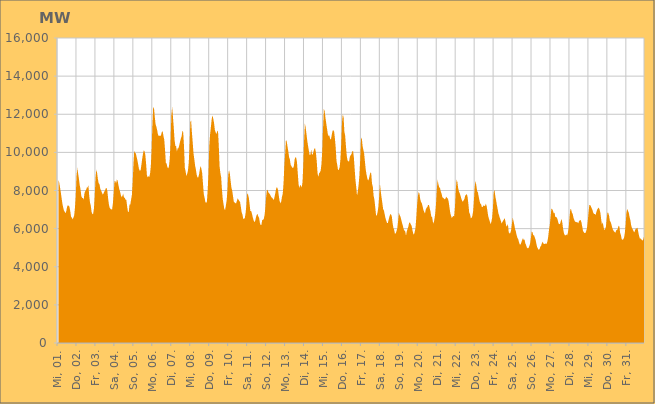
| Category | Series 0 |
|---|---|
|  Mi, 01.  | 8571.647 |
|  Mi, 01.  | 8426.877 |
|  Mi, 01.  | 8174.192 |
|  Mi, 01.  | 7919.734 |
|  Mi, 01.  | 7615.612 |
|  Mi, 01.  | 7327.224 |
|  Mi, 01.  | 7123.743 |
|  Mi, 01.  | 6951.614 |
|  Mi, 01.  | 6889.42 |
|  Mi, 01.  | 6799.561 |
|  Mi, 01.  | 6918.251 |
|  Mi, 01.  | 7138.162 |
|  Mi, 01.  | 7220.877 |
|  Mi, 01.  | 7203.933 |
|  Mi, 01.  | 7142.081 |
|  Mi, 01.  | 6918.803 |
|  Mi, 01.  | 6635.14 |
|  Do, 02.  | 6570.064 |
|  Do, 02.  | 6494.347 |
|  Do, 02.  | 6576.544 |
|  Do, 02.  | 6701.221 |
|  Do, 02.  | 7106.355 |
|  Do, 02.  | 7741.961 |
|  Do, 02.  | 8745.921 |
|  Do, 02.  | 9194.909 |
|  Do, 02.  | 8880.697 |
|  Do, 02.  | 8610.397 |
|  Do, 02.  | 8279.688 |
|  Do, 02.  | 8065.954 |
|  Do, 02.  | 7710.196 |
|  Do, 02.  | 7613.746 |
|  Do, 02.  | 7604.504 |
|  Do, 02.  | 7521.258 |
|  Do, 02.  | 7854.901 |
|  Do, 02.  | 7972.572 |
|  Do, 02.  | 8030.984 |
|  Do, 02.  | 8151.544 |
|  Do, 02.  | 8163.946 |
|  Do, 02.  | 8269.278 |
|  Do, 02.  | 7725.154 |
|  Do, 02.  | 7374.644 |
|  Fr, 03.  | 7199.698 |
|  Fr, 03.  | 6880.816 |
|  Fr, 03.  | 6752.79 |
|  Fr, 03.  | 6785.406 |
|  Fr, 03.  | 7052.271 |
|  Fr, 03.  | 7707.023 |
|  Fr, 03.  | 8664.792 |
|  Fr, 03.  | 9097.281 |
|  Fr, 03.  | 8911.047 |
|  Fr, 03.  | 8594.239 |
|  Fr, 03.  | 8380.961 |
|  Fr, 03.  | 8333.97 |
|  Fr, 03.  | 8096.653 |
|  Fr, 03.  | 7998.343 |
|  Fr, 03.  | 7906.099 |
|  Fr, 03.  | 7783.794 |
|  Fr, 03.  | 7829.25 |
|  Fr, 03.  | 7941.611 |
|  Fr, 03.  | 7988.13 |
|  Fr, 03.  | 8112.931 |
|  Fr, 03.  | 8135.249 |
|  Fr, 03.  | 7959.463 |
|  Fr, 03.  | 7563.892 |
|  Fr, 03.  | 7247.544 |
|  Sa, 04.  | 7086.04 |
|  Sa, 04.  | 7039.534 |
|  Sa, 04.  | 7000.788 |
|  Sa, 04.  | 7015.111 |
|  Sa, 04.  | 7328.287 |
|  Sa, 04.  | 7860.821 |
|  Sa, 04.  | 8484.789 |
|  Sa, 04.  | 8502.943 |
|  Sa, 04.  | 8368.934 |
|  Sa, 04.  | 8575.022 |
|  Sa, 04.  | 8508.639 |
|  Sa, 04.  | 8285.451 |
|  Sa, 04.  | 8081.265 |
|  Sa, 04.  | 7948.269 |
|  Sa, 04.  | 7762.259 |
|  Sa, 04.  | 7648.3 |
|  Sa, 04.  | 7708.836 |
|  Sa, 04.  | 7834.646 |
|  Sa, 04.  | 7631.67 |
|  Sa, 04.  | 7615.977 |
|  Sa, 04.  | 7518.765 |
|  Sa, 04.  | 7505.922 |
|  Sa, 04.  | 7175.152 |
|  Sa, 04.  | 6902.39 |
|  So, 05.  | 6861.662 |
|  So, 05.  | 7260.344 |
|  So, 05.  | 7257.732 |
|  So, 05.  | 7509.298 |
|  So, 05.  | 7756.565 |
|  So, 05.  | 8413.171 |
|  So, 05.  | 9349.163 |
|  So, 05.  | 10081.156 |
|  So, 05.  | 9991.604 |
|  So, 05.  | 9938.82 |
|  So, 05.  | 9767.937 |
|  So, 05.  | 9586.613 |
|  So, 05.  | 9366.691 |
|  So, 05.  | 9129.687 |
|  So, 05.  | 9039.358 |
|  So, 05.  | 9048.405 |
|  So, 05.  | 9320.406 |
|  So, 05.  | 9638.77 |
|  So, 05.  | 9907.633 |
|  So, 05.  | 10113.699 |
|  So, 05.  | 10064.82 |
|  So, 05.  | 9890.508 |
|  So, 05.  | 9410.213 |
|  So, 05.  | 8817.177 |
|  Mo, 06.  | 8687.779 |
|  Mo, 06.  | 8754.114 |
|  Mo, 06.  | 8704.742 |
|  Mo, 06.  | 8874.14 |
|  Mo, 06.  | 9290.863 |
|  Mo, 06.  | 10154.68 |
|  Mo, 06.  | 11438.301 |
|  Mo, 06.  | 12376.24 |
|  Mo, 06.  | 12323.719 |
|  Mo, 06.  | 11864.464 |
|  Mo, 06.  | 11479.18 |
|  Mo, 06.  | 11346.597 |
|  Mo, 06.  | 11166.686 |
|  Mo, 06.  | 10949.411 |
|  Mo, 06.  | 10861.368 |
|  Mo, 06.  | 10879.682 |
|  Mo, 06.  | 10859.749 |
|  Mo, 06.  | 10918.038 |
|  Mo, 06.  | 11075.591 |
|  Mo, 06.  | 11112.388 |
|  Mo, 06.  | 10859.448 |
|  Mo, 06.  | 10662.116 |
|  Mo, 06.  | 10127.498 |
|  Mo, 06.  | 9459.695 |
|  Di, 07.  | 9400.318 |
|  Di, 07.  | 9224.206 |
|  Di, 07.  | 9159.105 |
|  Di, 07.  | 9281.644 |
|  Di, 07.  | 9706.687 |
|  Di, 07.  | 10569.595 |
|  Di, 07.  | 11954.95 |
|  Di, 07.  | 12383.971 |
|  Di, 07.  | 11879.901 |
|  Di, 07.  | 11315.155 |
|  Di, 07.  | 10670.19 |
|  Di, 07.  | 10344.357 |
|  Di, 07.  | 10328.845 |
|  Di, 07.  | 10048.882 |
|  Di, 07.  | 10216.811 |
|  Di, 07.  | 10223.369 |
|  Di, 07.  | 10368.972 |
|  Di, 07.  | 10566.913 |
|  Di, 07.  | 10717.155 |
|  Di, 07.  | 10849.11 |
|  Di, 07.  | 11140.287 |
|  Di, 07.  | 11038.815 |
|  Di, 07.  | 10316.7 |
|  Di, 07.  | 9191.994 |
|  Mi, 08.  | 9006.042 |
|  Mi, 08.  | 8763.545 |
|  Mi, 08.  | 8868.43 |
|  Mi, 08.  | 9051.291 |
|  Mi, 08.  | 9469.174 |
|  Mi, 08.  | 10294.295 |
|  Mi, 08.  | 11597.989 |
|  Mi, 08.  | 11656.389 |
|  Mi, 08.  | 11040.685 |
|  Mi, 08.  | 10524.808 |
|  Mi, 08.  | 9962.422 |
|  Mi, 08.  | 9647.922 |
|  Mi, 08.  | 9318.093 |
|  Mi, 08.  | 9101.162 |
|  Mi, 08.  | 8838.934 |
|  Mi, 08.  | 8690.254 |
|  Mi, 08.  | 8679.062 |
|  Mi, 08.  | 8834.679 |
|  Mi, 08.  | 9101.332 |
|  Mi, 08.  | 9290.782 |
|  Mi, 08.  | 9139.991 |
|  Mi, 08.  | 8912.955 |
|  Mi, 08.  | 8375.249 |
|  Mi, 08.  | 7813.641 |
|  Do, 09.  | 7629.327 |
|  Do, 09.  | 7403.606 |
|  Do, 09.  | 7343.431 |
|  Do, 09.  | 7425.999 |
|  Do, 09.  | 8048.599 |
|  Do, 09.  | 8943.596 |
|  Do, 09.  | 10354.489 |
|  Do, 09.  | 10941.685 |
|  Do, 09.  | 11324.456 |
|  Do, 09.  | 11727.201 |
|  Do, 09.  | 11946.569 |
|  Do, 09.  | 11770.654 |
|  Do, 09.  | 11549.791 |
|  Do, 09.  | 11187.017 |
|  Do, 09.  | 11058.278 |
|  Do, 09.  | 10961.582 |
|  Do, 09.  | 11096.683 |
|  Do, 09.  | 11142.685 |
|  Do, 09.  | 10359.959 |
|  Do, 09.  | 9279.158 |
|  Do, 09.  | 8920.823 |
|  Do, 09.  | 8707.169 |
|  Do, 09.  | 8059.932 |
|  Do, 09.  | 7558.827 |
|  Fr, 10.  | 7290.935 |
|  Fr, 10.  | 7029.924 |
|  Fr, 10.  | 6979.596 |
|  Fr, 10.  | 7212.165 |
|  Fr, 10.  | 7490.523 |
|  Fr, 10.  | 7985.756 |
|  Fr, 10.  | 8819.296 |
|  Fr, 10.  | 9075.813 |
|  Fr, 10.  | 8886.171 |
|  Fr, 10.  | 8500.165 |
|  Fr, 10.  | 8154.371 |
|  Fr, 10.  | 7996.891 |
|  Fr, 10.  | 7713.795 |
|  Fr, 10.  | 7416.882 |
|  Fr, 10.  | 7378.273 |
|  Fr, 10.  | 7333.653 |
|  Fr, 10.  | 7334.386 |
|  Fr, 10.  | 7456.261 |
|  Fr, 10.  | 7600.766 |
|  Fr, 10.  | 7516.403 |
|  Fr, 10.  | 7447.968 |
|  Fr, 10.  | 7388.597 |
|  Fr, 10.  | 7126.645 |
|  Fr, 10.  | 6846.75 |
|  Sa, 11.  | 6735.657 |
|  Sa, 11.  | 6502.311 |
|  Sa, 11.  | 6524.645 |
|  Sa, 11.  | 6554.593 |
|  Sa, 11.  | 6838.809 |
|  Sa, 11.  | 7246.53 |
|  Sa, 11.  | 7852.489 |
|  Sa, 11.  | 7798.046 |
|  Sa, 11.  | 7628.296 |
|  Sa, 11.  | 7288.512 |
|  Sa, 11.  | 6919.213 |
|  Sa, 11.  | 6931.408 |
|  Sa, 11.  | 6779.353 |
|  Sa, 11.  | 6600.198 |
|  Sa, 11.  | 6446.27 |
|  Sa, 11.  | 6350.43 |
|  Sa, 11.  | 6391.78 |
|  Sa, 11.  | 6578.94 |
|  Sa, 11.  | 6719.998 |
|  Sa, 11.  | 6774.377 |
|  Sa, 11.  | 6639.628 |
|  Sa, 11.  | 6563.166 |
|  Sa, 11.  | 6313.126 |
|  Sa, 11.  | 6183.622 |
|  So, 12.  | 6199.043 |
|  So, 12.  | 6463.026 |
|  So, 12.  | 6452.082 |
|  So, 12.  | 6514.975 |
|  So, 12.  | 6718.402 |
|  So, 12.  | 7124.816 |
|  So, 12.  | 7684.024 |
|  So, 12.  | 8041.953 |
|  So, 12.  | 8009.718 |
|  So, 12.  | 7878.899 |
|  So, 12.  | 7845.7 |
|  So, 12.  | 7780.018 |
|  So, 12.  | 7695.036 |
|  So, 12.  | 7624.28 |
|  So, 12.  | 7606.221 |
|  So, 12.  | 7506.109 |
|  So, 12.  | 7557.176 |
|  So, 12.  | 7744.917 |
|  So, 12.  | 7961.736 |
|  So, 12.  | 8166.429 |
|  So, 12.  | 8152.623 |
|  So, 12.  | 8035.42 |
|  So, 12.  | 7712.305 |
|  So, 12.  | 7456.712 |
|  Mo, 13.  | 7329.712 |
|  Mo, 13.  | 7419.99 |
|  Mo, 13.  | 7669.958 |
|  Mo, 13.  | 7834.72 |
|  Mo, 13.  | 8403.221 |
|  Mo, 13.  | 9275.598 |
|  Mo, 13.  | 9916.2 |
|  Mo, 13.  | 10653.949 |
|  Mo, 13.  | 10570.78 |
|  Mo, 13.  | 10306.35 |
|  Mo, 13.  | 10062.44 |
|  Mo, 13.  | 9747.009 |
|  Mo, 13.  | 9620.906 |
|  Mo, 13.  | 9349.781 |
|  Mo, 13.  | 9278.465 |
|  Mo, 13.  | 9201.595 |
|  Mo, 13.  | 9173.783 |
|  Mo, 13.  | 9269.227 |
|  Mo, 13.  | 9619.164 |
|  Mo, 13.  | 9746.51 |
|  Mo, 13.  | 9719.824 |
|  Mo, 13.  | 9483.224 |
|  Mo, 13.  | 8908.112 |
|  Mo, 13.  | 8335.508 |
|  Di, 14.  | 8130.729 |
|  Di, 14.  | 8287.101 |
|  Di, 14.  | 8254.573 |
|  Di, 14.  | 8158.058 |
|  Di, 14.  | 8443.309 |
|  Di, 14.  | 9364.601 |
|  Di, 14.  | 10623.518 |
|  Di, 14.  | 11514.606 |
|  Di, 14.  | 11298.218 |
|  Di, 14.  | 10971.051 |
|  Di, 14.  | 10611.005 |
|  Di, 14.  | 10347.548 |
|  Di, 14.  | 10091.946 |
|  Di, 14.  | 9867.667 |
|  Di, 14.  | 9871.143 |
|  Di, 14.  | 10157.194 |
|  Di, 14.  | 9887.849 |
|  Di, 14.  | 9888.646 |
|  Di, 14.  | 10056.588 |
|  Di, 14.  | 10203.695 |
|  Di, 14.  | 10197.688 |
|  Di, 14.  | 9978.392 |
|  Di, 14.  | 9534.342 |
|  Di, 14.  | 8912.538 |
|  Mi, 15.  | 8716.574 |
|  Mi, 15.  | 8897.079 |
|  Mi, 15.  | 8955.884 |
|  Mi, 15.  | 9048.334 |
|  Mi, 15.  | 9396.29 |
|  Mi, 15.  | 10090.04 |
|  Mi, 15.  | 11282.926 |
|  Mi, 15.  | 12278.925 |
|  Mi, 15.  | 12170.096 |
|  Mi, 15.  | 11827.609 |
|  Mi, 15.  | 11532.026 |
|  Mi, 15.  | 11250.75 |
|  Mi, 15.  | 10966.156 |
|  Mi, 15.  | 10863.369 |
|  Mi, 15.  | 10881.824 |
|  Mi, 15.  | 10703.479 |
|  Mi, 15.  | 10675.196 |
|  Mi, 15.  | 10917.86 |
|  Mi, 15.  | 11129.211 |
|  Mi, 15.  | 11163.338 |
|  Mi, 15.  | 11090.554 |
|  Mi, 15.  | 10727.101 |
|  Mi, 15.  | 10258.971 |
|  Mi, 15.  | 9556.182 |
|  Do, 16.  | 9332.393 |
|  Do, 16.  | 9069.282 |
|  Do, 16.  | 9097.368 |
|  Do, 16.  | 9219.017 |
|  Do, 16.  | 9638.445 |
|  Do, 16.  | 10464.05 |
|  Do, 16.  | 11607.541 |
|  Do, 16.  | 11994.08 |
|  Do, 16.  | 11837.791 |
|  Do, 16.  | 11081.905 |
|  Do, 16.  | 10863.831 |
|  Do, 16.  | 10309.103 |
|  Do, 16.  | 9818.566 |
|  Do, 16.  | 9581.508 |
|  Do, 16.  | 9521.292 |
|  Do, 16.  | 9540.69 |
|  Do, 16.  | 9776.926 |
|  Do, 16.  | 9856.688 |
|  Do, 16.  | 9908.05 |
|  Do, 16.  | 10056.836 |
|  Do, 16.  | 10076.524 |
|  Do, 16.  | 9733.911 |
|  Do, 16.  | 9126.464 |
|  Do, 16.  | 8552.411 |
|  Fr, 17.  | 8182.188 |
|  Fr, 17.  | 7732.823 |
|  Fr, 17.  | 7955.387 |
|  Fr, 17.  | 8299.233 |
|  Fr, 17.  | 8778.813 |
|  Fr, 17.  | 9594.816 |
|  Fr, 17.  | 10663.317 |
|  Fr, 17.  | 10786.53 |
|  Fr, 17.  | 10330.884 |
|  Fr, 17.  | 10142.611 |
|  Fr, 17.  | 9936.526 |
|  Fr, 17.  | 9517.088 |
|  Fr, 17.  | 9106.264 |
|  Fr, 17.  | 8840.94 |
|  Fr, 17.  | 8638.714 |
|  Fr, 17.  | 8521.656 |
|  Fr, 17.  | 8605.41 |
|  Fr, 17.  | 8793.173 |
|  Fr, 17.  | 8962.855 |
|  Fr, 17.  | 8888.07 |
|  Fr, 17.  | 8351.574 |
|  Fr, 17.  | 8196.856 |
|  Fr, 17.  | 7730.287 |
|  Fr, 17.  | 7519.657 |
|  Sa, 18.  | 7144.951 |
|  Sa, 18.  | 6729.825 |
|  Sa, 18.  | 6666.669 |
|  Sa, 18.  | 6864.629 |
|  Sa, 18.  | 7133.513 |
|  Sa, 18.  | 7663.242 |
|  Sa, 18.  | 8343.352 |
|  Sa, 18.  | 7976.948 |
|  Sa, 18.  | 7638.613 |
|  Sa, 18.  | 7360.899 |
|  Sa, 18.  | 7035.741 |
|  Sa, 18.  | 6953.286 |
|  Sa, 18.  | 6757.861 |
|  Sa, 18.  | 6552.468 |
|  Sa, 18.  | 6416.377 |
|  Sa, 18.  | 6292.029 |
|  Sa, 18.  | 6291.692 |
|  Sa, 18.  | 6468.023 |
|  Sa, 18.  | 6632.127 |
|  Sa, 18.  | 6762.166 |
|  Sa, 18.  | 6739.355 |
|  Sa, 18.  | 6654.738 |
|  Sa, 18.  | 6289.734 |
|  Sa, 18.  | 6042.812 |
|  So, 19.  | 5935.71 |
|  So, 19.  | 5724.343 |
|  So, 19.  | 5756.77 |
|  So, 19.  | 5866.519 |
|  So, 19.  | 6023.539 |
|  So, 19.  | 6389.17 |
|  So, 19.  | 6832.478 |
|  So, 19.  | 6700.584 |
|  So, 19.  | 6630.952 |
|  So, 19.  | 6462.36 |
|  So, 19.  | 6293.355 |
|  So, 19.  | 6155.742 |
|  So, 19.  | 5974.207 |
|  So, 19.  | 5896.663 |
|  So, 19.  | 5850.025 |
|  So, 19.  | 5632.887 |
|  So, 19.  | 5859.322 |
|  So, 19.  | 5994.047 |
|  So, 19.  | 6114.193 |
|  So, 19.  | 6310.492 |
|  So, 19.  | 6325.426 |
|  So, 19.  | 6219.876 |
|  So, 19.  | 6164.741 |
|  So, 19.  | 5948.823 |
|  Mo, 20.  | 5762.01 |
|  Mo, 20.  | 5682.593 |
|  Mo, 20.  | 5826.37 |
|  Mo, 20.  | 6032.774 |
|  Mo, 20.  | 6575.039 |
|  Mo, 20.  | 7230.556 |
|  Mo, 20.  | 7680.36 |
|  Mo, 20.  | 7922.865 |
|  Mo, 20.  | 7842.076 |
|  Mo, 20.  | 7544.018 |
|  Mo, 20.  | 7401.527 |
|  Mo, 20.  | 7326.072 |
|  Mo, 20.  | 7166.263 |
|  Mo, 20.  | 6982.161 |
|  Mo, 20.  | 6884.113 |
|  Mo, 20.  | 6799.872 |
|  Mo, 20.  | 6998.886 |
|  Mo, 20.  | 7096.528 |
|  Mo, 20.  | 7132.595 |
|  Mo, 20.  | 7243.132 |
|  Mo, 20.  | 7242.175 |
|  Mo, 20.  | 7072.035 |
|  Mo, 20.  | 6889.34 |
|  Mo, 20.  | 6635.138 |
|  Di, 21.  | 6608.378 |
|  Di, 21.  | 6360.742 |
|  Di, 21.  | 6271.071 |
|  Di, 21.  | 6509.021 |
|  Di, 21.  | 6796.926 |
|  Di, 21.  | 7300.234 |
|  Di, 21.  | 8063.459 |
|  Di, 21.  | 8568.784 |
|  Di, 21.  | 8334.609 |
|  Di, 21.  | 8163.668 |
|  Di, 21.  | 8134.016 |
|  Di, 21.  | 7950.176 |
|  Di, 21.  | 7835.354 |
|  Di, 21.  | 7646.731 |
|  Di, 21.  | 7619.63 |
|  Di, 21.  | 7577.85 |
|  Di, 21.  | 7531.211 |
|  Di, 21.  | 7584.076 |
|  Di, 21.  | 7682.032 |
|  Di, 21.  | 7597.655 |
|  Di, 21.  | 7583.119 |
|  Di, 21.  | 7412.54 |
|  Di, 21.  | 7118.104 |
|  Di, 21.  | 6819.143 |
|  Mi, 22.  | 6676.194 |
|  Mi, 22.  | 6557.578 |
|  Mi, 22.  | 6625.719 |
|  Mi, 22.  | 6661.271 |
|  Mi, 22.  | 6653.377 |
|  Mi, 22.  | 7152.731 |
|  Mi, 22.  | 8048.746 |
|  Mi, 22.  | 8572.916 |
|  Mi, 22.  | 8447.413 |
|  Mi, 22.  | 8128.14 |
|  Mi, 22.  | 7943.102 |
|  Mi, 22.  | 7850.834 |
|  Mi, 22.  | 7734.604 |
|  Mi, 22.  | 7571.61 |
|  Mi, 22.  | 7469.358 |
|  Mi, 22.  | 7408.042 |
|  Mi, 22.  | 7490.169 |
|  Mi, 22.  | 7557.641 |
|  Mi, 22.  | 7747.36 |
|  Mi, 22.  | 7762.951 |
|  Mi, 22.  | 7825.221 |
|  Mi, 22.  | 7640.998 |
|  Mi, 22.  | 7267.923 |
|  Mi, 22.  | 6841.721 |
|  Do, 23.  | 6761.165 |
|  Do, 23.  | 6543.473 |
|  Do, 23.  | 6569.33 |
|  Do, 23.  | 6673.901 |
|  Do, 23.  | 6926.712 |
|  Do, 23.  | 7511.311 |
|  Do, 23.  | 8204.048 |
|  Do, 23.  | 8510.529 |
|  Do, 23.  | 8271.053 |
|  Do, 23.  | 7969.236 |
|  Do, 23.  | 7903.671 |
|  Do, 23.  | 7672.838 |
|  Do, 23.  | 7469.807 |
|  Do, 23.  | 7313.912 |
|  Do, 23.  | 7279.43 |
|  Do, 23.  | 7137.455 |
|  Do, 23.  | 7135.826 |
|  Do, 23.  | 7223.21 |
|  Do, 23.  | 7197.502 |
|  Do, 23.  | 7177.502 |
|  Do, 23.  | 7313.373 |
|  Do, 23.  | 7198.463 |
|  Do, 23.  | 6949.604 |
|  Do, 23.  | 6665.275 |
|  Fr, 24.  | 6521.264 |
|  Fr, 24.  | 6384.253 |
|  Fr, 24.  | 6237.117 |
|  Fr, 24.  | 6344.313 |
|  Fr, 24.  | 6570.95 |
|  Fr, 24.  | 7049.942 |
|  Fr, 24.  | 7880.328 |
|  Fr, 24.  | 8049.406 |
|  Fr, 24.  | 7706.884 |
|  Fr, 24.  | 7489.101 |
|  Fr, 24.  | 7244.811 |
|  Fr, 24.  | 7023.933 |
|  Fr, 24.  | 6791.054 |
|  Fr, 24.  | 6665.905 |
|  Fr, 24.  | 6528.814 |
|  Fr, 24.  | 6413.181 |
|  Fr, 24.  | 6262.257 |
|  Fr, 24.  | 6355.546 |
|  Fr, 24.  | 6416.422 |
|  Fr, 24.  | 6490.52 |
|  Fr, 24.  | 6548.96 |
|  Fr, 24.  | 6344.816 |
|  Fr, 24.  | 6107.729 |
|  Fr, 24.  | 6146.872 |
|  Sa, 25.  | 6234.572 |
|  Sa, 25.  | 5815.271 |
|  Sa, 25.  | 5744.392 |
|  Sa, 25.  | 5766.894 |
|  Sa, 25.  | 5915.901 |
|  Sa, 25.  | 6234.581 |
|  Sa, 25.  | 6580.381 |
|  Sa, 25.  | 6414.517 |
|  Sa, 25.  | 6215.411 |
|  Sa, 25.  | 5986.45 |
|  Sa, 25.  | 5862.365 |
|  Sa, 25.  | 5660.757 |
|  Sa, 25.  | 5517.169 |
|  Sa, 25.  | 5453.373 |
|  Sa, 25.  | 5293.072 |
|  Sa, 25.  | 5166.547 |
|  Sa, 25.  | 5164.799 |
|  Sa, 25.  | 5285.498 |
|  Sa, 25.  | 5399.081 |
|  Sa, 25.  | 5497.689 |
|  Sa, 25.  | 5409.751 |
|  Sa, 25.  | 5428.416 |
|  Sa, 25.  | 5230.943 |
|  Sa, 25.  | 5137.217 |
|  So, 26.  | 5011.766 |
|  So, 26.  | 4965.227 |
|  So, 26.  | 4980.395 |
|  So, 26.  | 5072.182 |
|  So, 26.  | 5209.566 |
|  So, 26.  | 5489.642 |
|  So, 26.  | 5840.463 |
|  So, 26.  | 5822.704 |
|  So, 26.  | 5657.476 |
|  So, 26.  | 5654.59 |
|  So, 26.  | 5540.759 |
|  So, 26.  | 5417.885 |
|  So, 26.  | 5204.205 |
|  So, 26.  | 5033.167 |
|  So, 26.  | 4952.699 |
|  So, 26.  | 4884.154 |
|  So, 26.  | 4921.367 |
|  So, 26.  | 5048.655 |
|  So, 26.  | 5102.603 |
|  So, 26.  | 5243.188 |
|  So, 26.  | 5311.964 |
|  So, 26.  | 5212.955 |
|  So, 26.  | 5199.325 |
|  So, 26.  | 5199.799 |
|  Mo, 27.  | 5227.25 |
|  Mo, 27.  | 5189.104 |
|  Mo, 27.  | 5334.26 |
|  Mo, 27.  | 5581.577 |
|  Mo, 27.  | 5939.817 |
|  Mo, 27.  | 6194.724 |
|  Mo, 27.  | 6618.283 |
|  Mo, 27.  | 7041.211 |
|  Mo, 27.  | 7024.537 |
|  Mo, 27.  | 6939.752 |
|  Mo, 27.  | 6801.631 |
|  Mo, 27.  | 6835.223 |
|  Mo, 27.  | 6606.684 |
|  Mo, 27.  | 6614.924 |
|  Mo, 27.  | 6568.815 |
|  Mo, 27.  | 6458.155 |
|  Mo, 27.  | 6283.896 |
|  Mo, 27.  | 6225.949 |
|  Mo, 27.  | 6253.145 |
|  Mo, 27.  | 6399.972 |
|  Mo, 27.  | 6506.709 |
|  Mo, 27.  | 6269.889 |
|  Mo, 27.  | 5948.971 |
|  Mo, 27.  | 5739.081 |
|  Di, 28.  | 5654.887 |
|  Di, 28.  | 5643.746 |
|  Di, 28.  | 5692.431 |
|  Di, 28.  | 5647.629 |
|  Di, 28.  | 5802.373 |
|  Di, 28.  | 6093.495 |
|  Di, 28.  | 6605.247 |
|  Di, 28.  | 7033.627 |
|  Di, 28.  | 6996.849 |
|  Di, 28.  | 6834.205 |
|  Di, 28.  | 6770.06 |
|  Di, 28.  | 6570.434 |
|  Di, 28.  | 6447.913 |
|  Di, 28.  | 6366.156 |
|  Di, 28.  | 6354.079 |
|  Di, 28.  | 6338.154 |
|  Di, 28.  | 6339.572 |
|  Di, 28.  | 6275.95 |
|  Di, 28.  | 6403.461 |
|  Di, 28.  | 6428.536 |
|  Di, 28.  | 6453.254 |
|  Di, 28.  | 6339.377 |
|  Di, 28.  | 6122.716 |
|  Di, 28.  | 5888.513 |
|  Mi, 29.  | 5813.335 |
|  Mi, 29.  | 5765.809 |
|  Mi, 29.  | 5767.444 |
|  Mi, 29.  | 5868.719 |
|  Mi, 29.  | 6012.694 |
|  Mi, 29.  | 6376.467 |
|  Mi, 29.  | 6828.613 |
|  Mi, 29.  | 7232.049 |
|  Mi, 29.  | 7242.188 |
|  Mi, 29.  | 7171.159 |
|  Mi, 29.  | 7070.242 |
|  Mi, 29.  | 6987.602 |
|  Mi, 29.  | 6829.185 |
|  Mi, 29.  | 6772.124 |
|  Mi, 29.  | 6772.679 |
|  Mi, 29.  | 6710.374 |
|  Mi, 29.  | 6879.291 |
|  Mi, 29.  | 7001.143 |
|  Mi, 29.  | 7065.079 |
|  Mi, 29.  | 7102.217 |
|  Mi, 29.  | 7002.96 |
|  Mi, 29.  | 6836.927 |
|  Mi, 29.  | 6499.055 |
|  Mi, 29.  | 6212.33 |
|  Do, 30.  | 6345.174 |
|  Do, 30.  | 6100.273 |
|  Do, 30.  | 5930.206 |
|  Do, 30.  | 5971.203 |
|  Do, 30.  | 6097.571 |
|  Do, 30.  | 6502.069 |
|  Do, 30.  | 6851.718 |
|  Do, 30.  | 6821.4 |
|  Do, 30.  | 6687.631 |
|  Do, 30.  | 6412.269 |
|  Do, 30.  | 6350.295 |
|  Do, 30.  | 6226.702 |
|  Do, 30.  | 6056.963 |
|  Do, 30.  | 5937.581 |
|  Do, 30.  | 5870.703 |
|  Do, 30.  | 5821.942 |
|  Do, 30.  | 5786.484 |
|  Do, 30.  | 5912.111 |
|  Do, 30.  | 5928.699 |
|  Do, 30.  | 5986.804 |
|  Do, 30.  | 6149.034 |
|  Do, 30.  | 6115.993 |
|  Do, 30.  | 5791.1 |
|  Do, 30.  | 5657.29 |
|  Fr, 31.  | 5451.108 |
|  Fr, 31.  | 5412.839 |
|  Fr, 31.  | 5438.577 |
|  Fr, 31.  | 5524.727 |
|  Fr, 31.  | 5782.389 |
|  Fr, 31.  | 6213.783 |
|  Fr, 31.  | 6844.498 |
|  Fr, 31.  | 7036.676 |
|  Fr, 31.  | 6931.041 |
|  Fr, 31.  | 6833.637 |
|  Fr, 31.  | 6596.808 |
|  Fr, 31.  | 6436.436 |
|  Fr, 31.  | 6175.394 |
|  Fr, 31.  | 6026.965 |
|  Fr, 31.  | 5963.277 |
|  Fr, 31.  | 5864.582 |
|  Fr, 31.  | 5803.867 |
|  Fr, 31.  | 5926.488 |
|  Fr, 31.  | 6014.381 |
|  Fr, 31.  | 6008.022 |
|  Fr, 31.  | 6047.381 |
|  Fr, 31.  | 5822.695 |
|  Fr, 31.  | 5614.882 |
|  Fr, 31.  | 5487.777 |
|  Sa, 01.  | 5485.239 |
|  Sa, 01.  | 5433.867 |
|  Sa, 01.  | 5377.763 |
|  Sa, 01.  | 5398.422 |
|  Sa, 01.  | 5537.513 |
|  Sa, 01.  | 5801.347 |